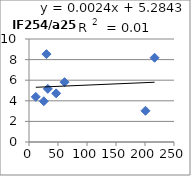
| Category | IF254/a254 |
|---|---|
| 25.5 | 3.96 |
| 61.3 | 5.81 |
| 11.7 | 4.38 |
| 216.5 | 8.18 |
| 46.8 | 4.72 |
| 32.5 | 5.16 |
| 200.8 | 3.03 |
| 30.1 | 8.53 |